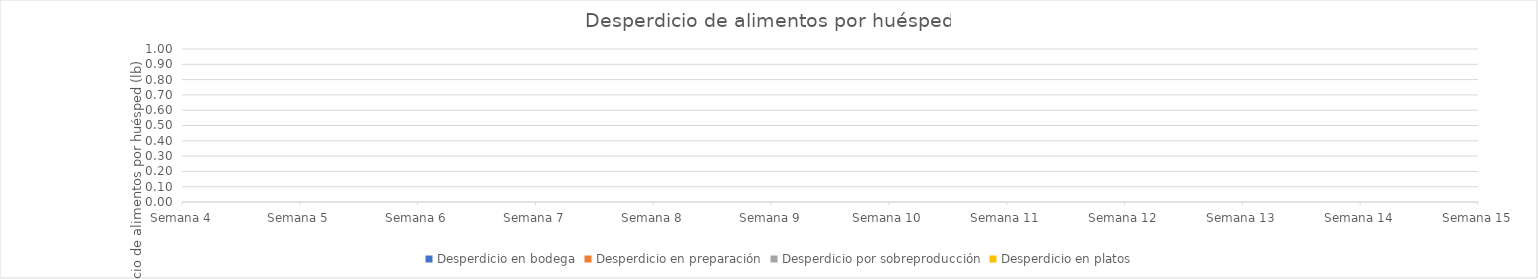
| Category | Desperdicio en bodega | Desperdicio en preparación | Desperdicio por sobreproducción | Desperdicio en platos |
|---|---|---|---|---|
| Semana 4 | 0 | 0 | 0 | 0 |
| Semana 5 | 0 | 0 | 0 | 0 |
| Semana 6 | 0 | 0 | 0 | 0 |
| Semana 7 | 0 | 0 | 0 | 0 |
| Semana 8 | 0 | 0 | 0 | 0 |
| Semana 9 | 0 | 0 | 0 | 0 |
| Semana 10 | 0 | 0 | 0 | 0 |
| Semana 11 | 0 | 0 | 0 | 0 |
| Semana 12 | 0 | 0 | 0 | 0 |
| Semana 13 | 0 | 0 | 0 | 0 |
| Semana 14 | 0 | 0 | 0 | 0 |
| Semana 15 | 0 | 0 | 0 | 0 |